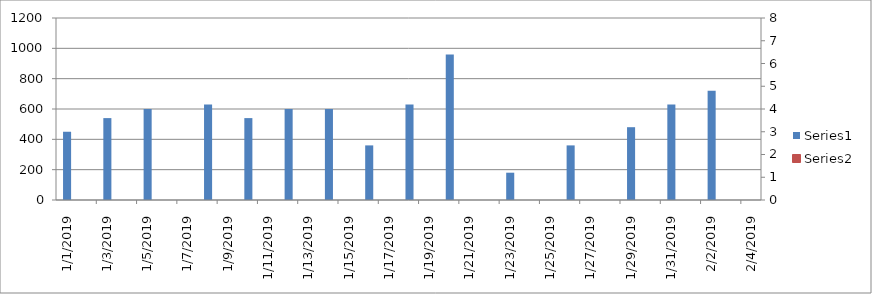
| Category | Series 0 |
|---|---|
| 1/1/19 | 450 |
| 1/2/19 | 0 |
| 1/3/19 | 540 |
| 1/4/19 | 0 |
| 1/5/19 | 600 |
| 1/6/19 | 0 |
| 1/7/19 | 0 |
| 1/8/19 | 630 |
| 1/9/19 | 0 |
| 1/10/19 | 540 |
| 1/11/19 | 0 |
| 1/12/19 | 600 |
| 1/13/19 | 0 |
| 1/14/19 | 600 |
| 1/15/19 | 0 |
| 1/16/19 | 360 |
| 1/17/19 | 0 |
| 1/18/19 | 630 |
| 1/19/19 | 0 |
| 1/20/19 | 960 |
| 1/21/19 | 0 |
| 1/22/19 | 0 |
| 1/23/19 | 180 |
| 1/24/19 | 0 |
| 1/25/19 | 0 |
| 1/26/19 | 360 |
| 1/27/19 | 0 |
| 1/28/19 | 0 |
| 1/29/19 | 480 |
| 1/30/19 | 0 |
| 1/31/19 | 630 |
| 2/1/19 | 0 |
| 2/2/19 | 720 |
| 2/3/19 | 0 |
| 2/4/19 | 0 |